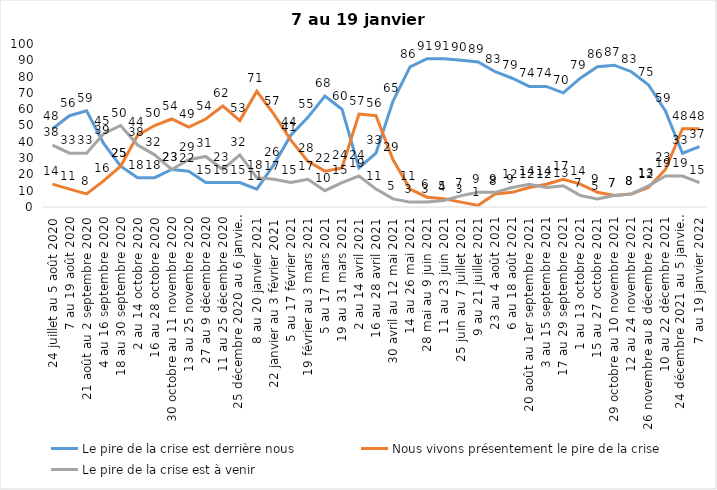
| Category | Le pire de la crise est derrière nous | Nous vivons présentement le pire de la crise | Le pire de la crise est à venir |
|---|---|---|---|
| 24 juillet au 5 août 2020 | 48 | 14 | 38 |
| 7 au 19 août 2020 | 56 | 11 | 33 |
| 21 août au 2 septembre 2020 | 59 | 8 | 33 |
| 4 au 16 septembre 2020 | 39 | 16 | 45 |
| 18 au 30 septembre 2020 | 25 | 25 | 50 |
| 2 au 14 octobre 2020 | 18 | 44 | 38 |
| 16 au 28 octobre 2020 | 18 | 50 | 32 |
| 30 octobre au 11 novembre 2020 | 23 | 54 | 23 |
| 13 au 25 novembre 2020 | 22 | 49 | 29 |
| 27 au 9 décembre 2020 | 15 | 54 | 31 |
| 11 au 25 décembre 2020 | 15 | 62 | 23 |
| 25 décembre 2020 au 6 janvier 2021 | 15 | 53 | 32 |
| 8 au 20 janvier 2021 | 11 | 71 | 18 |
| 22 janvier au 3 février 2021 | 26 | 57 | 17 |
| 5 au 17 février 2021 | 44 | 41 | 15 |
| 19 février au 3 mars 2021 | 55 | 28 | 17 |
| 5 au 17 mars 2021 | 68 | 22 | 10 |
| 19 au 31 mars 2021 | 60 | 24 | 15 |
| 2 au 14 avril 2021 | 24 | 57 | 19 |
| 16 au 28 avril 2021 | 33 | 56 | 11 |
| 30 avril au 12 mai 2021 | 65 | 29 | 5 |
| 14 au 26 mai 2021 | 86 | 11 | 3 |
| 28 mai au 9 juin 2021 | 91 | 6 | 3 |
| 11 au 23 juin 2021 | 91 | 5 | 4 |
| 25 juin au 7 juillet 2021 | 90 | 3 | 7 |
| 9 au 21 juillet 2021 | 89 | 1 | 9 |
| 23 au 4 août 2021 | 83 | 8 | 9 |
| 6 au 18 août 2021 | 79 | 9 | 12 |
| 20 août au 1er septembre 2021 | 74 | 12 | 14 |
| 3 au 15 septembre 2021 | 74 | 14 | 12 |
| 17 au 29 septembre 2021 | 70 | 17 | 13 |
| 1 au 13 octobre 2021 | 79 | 14 | 7 |
| 15 au 27 octobre 2021 | 86 | 9 | 5 |
| 29 octobre au 10 novembre 2021 | 87 | 7 | 7 |
| 12 au 24 novembre 2021 | 83 | 8 | 8 |
| 26 novembre au 8 décembre 2021 | 75 | 12 | 13 |
| 10 au 22 décembre 2021 | 59 | 23 | 19 |
| 24 décembre 2021 au 5 janvier 2022 | 33 | 48 | 19 |
| 7 au 19 janvier 2022 | 37 | 48 | 15 |